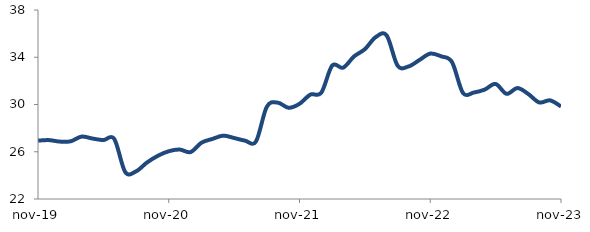
| Category | Series 0 |
|---|---|
| 2019-11-01 | 26.942 |
| 2019-12-01 | 26.986 |
| 2020-01-01 | 26.86 |
| 2020-02-01 | 26.885 |
| 2020-03-01 | 27.282 |
| 2020-04-01 | 27.118 |
| 2020-05-01 | 26.986 |
| 2020-06-01 | 27.082 |
| 2020-07-01 | 24.291 |
| 2020-08-01 | 24.343 |
| 2020-09-01 | 25.089 |
| 2020-10-01 | 25.658 |
| 2020-11-01 | 26.044 |
| 2020-12-01 | 26.188 |
| 2021-01-01 | 25.972 |
| 2021-02-01 | 26.764 |
| 2021-03-01 | 27.083 |
| 2021-04-01 | 27.363 |
| 2021-05-01 | 27.164 |
| 2021-06-01 | 26.939 |
| 2021-07-01 | 26.864 |
| 2021-08-01 | 29.808 |
| 2021-09-01 | 30.158 |
| 2021-10-01 | 29.722 |
| 2021-11-01 | 30.058 |
| 2021-12-01 | 30.839 |
| 2022-01-01 | 30.999 |
| 2022-02-01 | 33.297 |
| 2022-03-01 | 33.114 |
| 2022-04-01 | 34.066 |
| 2022-05-01 | 34.685 |
| 2022-06-01 | 35.71 |
| 2022-07-01 | 35.85 |
| 2022-08-01 | 33.294 |
| 2022-09-01 | 33.218 |
| 2022-10-01 | 33.762 |
| 2022-11-01 | 34.307 |
| 2022-12-01 | 34.079 |
| 2023-01-01 | 33.585 |
| 2023-02-01 | 30.978 |
| 2023-03-01 | 31.014 |
| 2023-04-01 | 31.263 |
| 2023-05-01 | 31.74 |
| 2023-06-01 | 30.902 |
| 2023-07-01 | 31.392 |
| 2023-08-01 | 30.886 |
| 2023-09-01 | 30.175 |
| 2023-10-01 | 30.349 |
| 2023-11-01 | 29.836 |